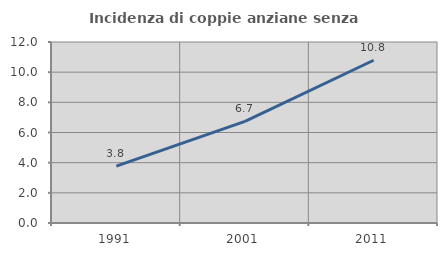
| Category | Incidenza di coppie anziane senza figli  |
|---|---|
| 1991.0 | 3.774 |
| 2001.0 | 6.742 |
| 2011.0 | 10.789 |